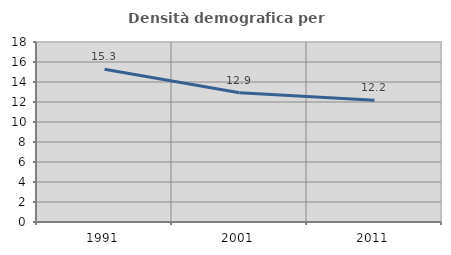
| Category | Densità demografica |
|---|---|
| 1991.0 | 15.265 |
| 2001.0 | 12.925 |
| 2011.0 | 12.18 |